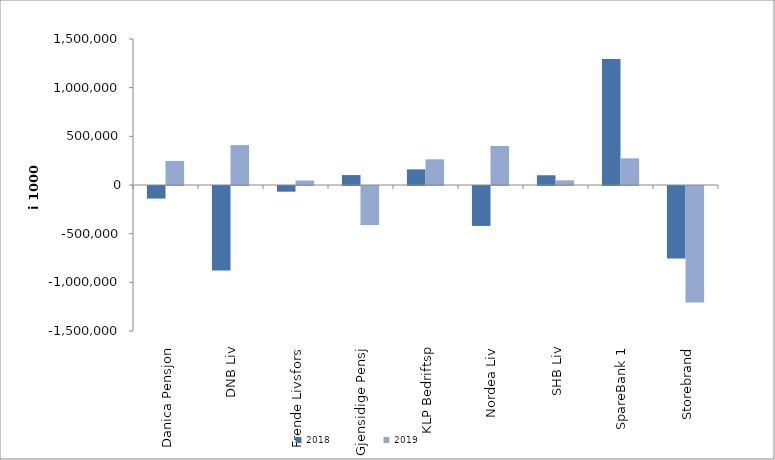
| Category | 2018 | 2019 |
|---|---|---|
| Danica Pensjon | -129055.097 | 247084.222 |
| DNB Liv | -867214 | 410023 |
| Frende Livsfors | -58437.729 | 45724 |
| Gjensidige Pensj | 101669 | -401668.1 |
| KLP Bedriftsp | 160568 | 263995 |
| Nordea Liv | -410143.851 | 400449.708 |
| SHB Liv | 100114 | 47887.003 |
| SpareBank 1 | 1294387.703 | 273876.597 |
| Storebrand | -744724.326 | -1195960.942 |